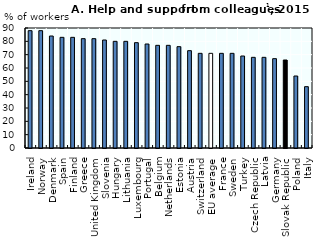
| Category | Series 0 |
|---|---|
| Ireland | 88 |
| Norway | 88 |
| Denmark | 84 |
| Spain | 83 |
| Finland | 83 |
| Greece | 82 |
| United Kingdom | 82 |
| Slovenia | 81 |
| Hungary | 80 |
| Lithuania | 80 |
| Luxembourg | 79 |
| Portugal | 78 |
| Belgium | 77 |
| Netherlands | 77 |
| Estonia | 76 |
| Austria | 73 |
| Switzerland | 71 |
| EU average | 71 |
| France | 71 |
| Sweden | 71 |
| Turkey | 69 |
| Czech Republic | 68 |
| Latvia | 68 |
| Germany | 67 |
| Slovak Republic | 66 |
| Poland | 54 |
| Italy | 46 |